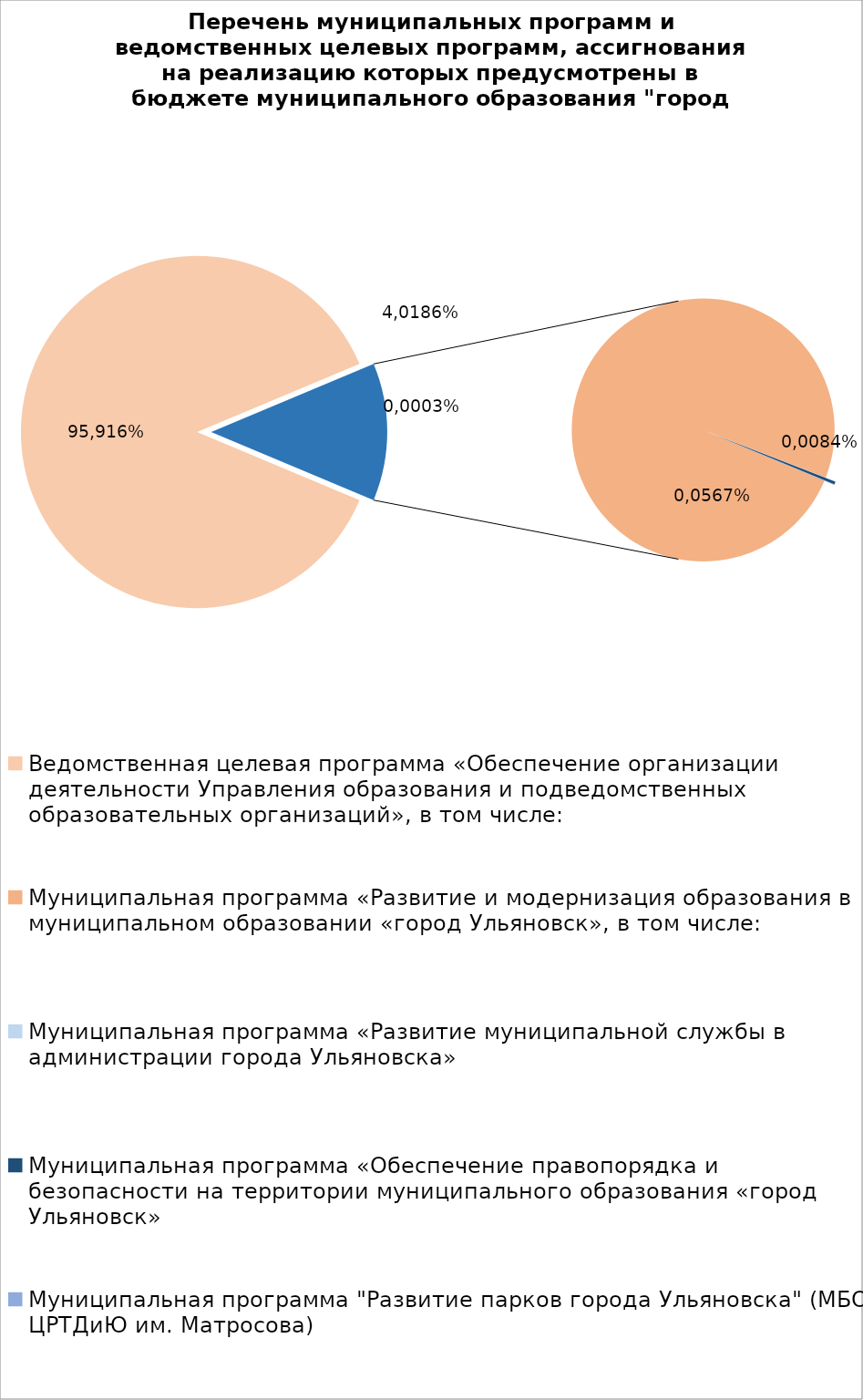
| Category | Series 0 |
|---|---|
| Ведомственная целевая программа «Обеспечение организации деятельности Управления образования и подведомственных образовательных организаций», в том числе: | 5169167.15 |
| Муниципальная программа «Развитие и модернизация образования в муниципальном образовании «город Ульяновск», в том числе: | 744545.6 |
| Муниципальная программа «Развитие муниципальной службы в администрации города Ульяновска» | 14.3 |
| Муниципальная программа «Обеспечение правопорядка и безопасности на территории муниципального образования «город Ульяновск» | 2700 |
| Муниципальная программа "Развитие парков города Ульяновска" (МБОУ ЦРТДиЮ им. Матросова) | 400 |